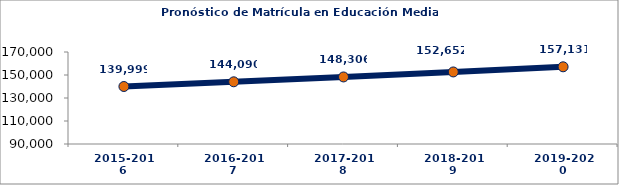
| Category | Series 1 |
|---|---|
| 2015-2016 | 139999.144 |
| 2016-2017 | 144089.804 |
| 2017-2018 | 148305.92 |
| 2018-2019 | 152651.571 |
| 2019-2020 | 157130.977 |